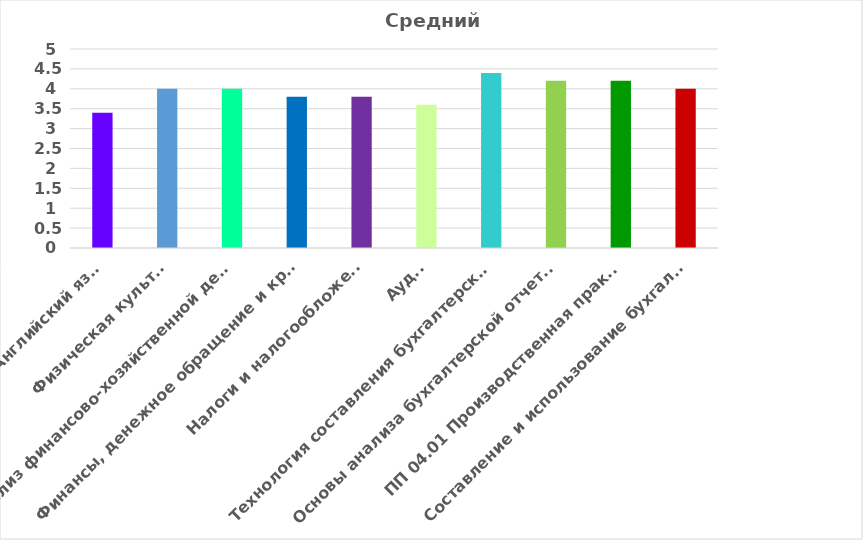
| Category | Средний балл |
|---|---|
| Английский язык | 3.4 |
| Физическая культура | 4 |
| Анализ финансово-хозяйственной деятельности | 4 |
| Финансы, денежное обращение и кредит | 3.8 |
| Налоги и налогообложение | 3.8 |
| Аудит | 3.6 |
| Технология составления бухгалтерской отчетности | 4.4 |
| Основы анализа бухгалтерской отчетности | 4.2 |
| ПП 04.01 Производственная практика | 4.2 |
| Составление и использование бухгалтерской отчетности | 4 |